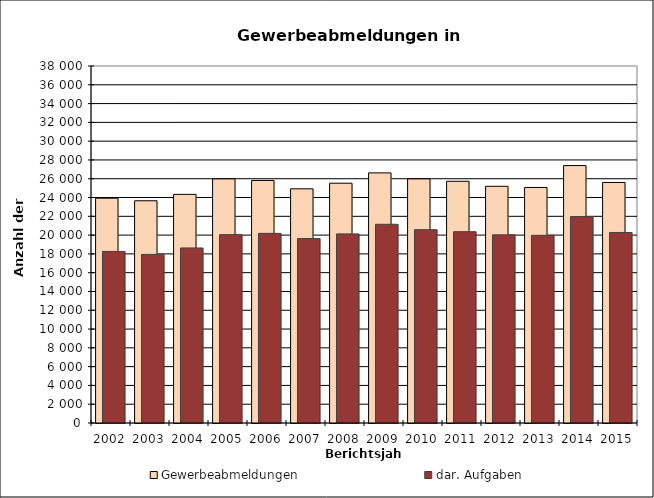
| Category | Gewerbeabmeldungen | dar. Aufgaben |
|---|---|---|
| 2002.0 | 23929 | 18260 |
| 2003.0 | 23654 | 17944 |
| 2004.0 | 24336 | 18633 |
| 2005.0 | 25984 | 20051 |
| 2006.0 | 25816 | 20185 |
| 2007.0 | 24926 | 19635 |
| 2008.0 | 25523 | 20128 |
| 2009.0 | 26623 | 21151 |
| 2010.0 | 25984 | 20578 |
| 2011.0 | 25729 | 20364 |
| 2012.0 | 25195 | 20027 |
| 2013.0 | 25071 | 19975 |
| 2014.0 | 27402 | 21971 |
| 2015.0 | 25601 | 20280 |